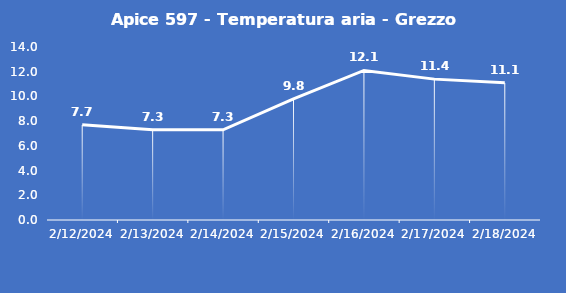
| Category | Apice 597 - Temperatura aria - Grezzo (°C) |
|---|---|
| 2/12/24 | 7.7 |
| 2/13/24 | 7.3 |
| 2/14/24 | 7.3 |
| 2/15/24 | 9.8 |
| 2/16/24 | 12.1 |
| 2/17/24 | 11.4 |
| 2/18/24 | 11.1 |